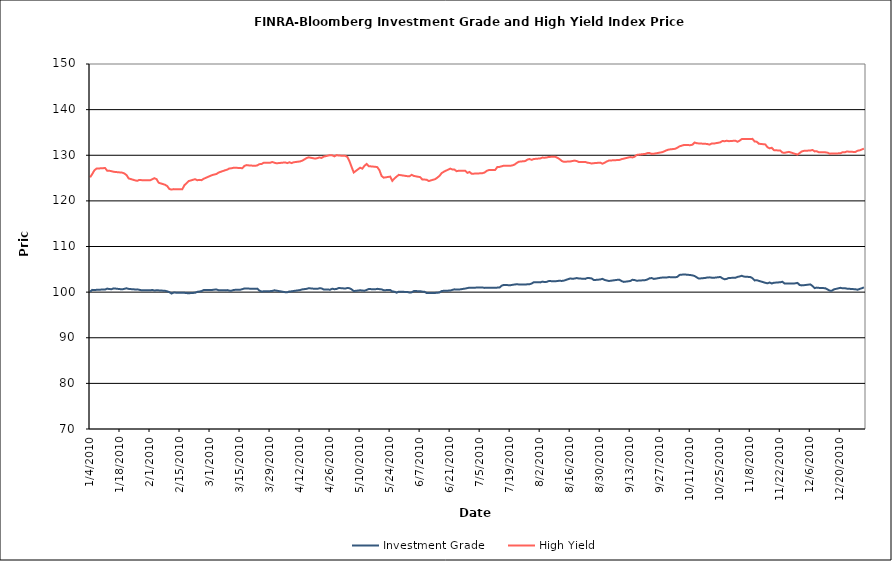
| Category | Investment Grade | High Yield |
|---|---|---|
| 1/4/10 | 100.102 | 125.163 |
| 1/5/10 | 100.49 | 125.873 |
| 1/6/10 | 100.447 | 126.69 |
| 1/7/10 | 100.503 | 127.071 |
| 1/8/10 | 100.542 | 127.104 |
| 1/11/10 | 100.559 | 127.199 |
| 1/12/10 | 100.775 | 126.595 |
| 1/13/10 | 100.668 | 126.609 |
| 1/14/10 | 100.647 | 126.495 |
| 1/15/10 | 100.825 | 126.376 |
| 1/19/10 | 100.604 | 126.186 |
| 1/20/10 | 100.724 | 126.008 |
| 1/21/10 | 100.842 | 125.662 |
| 1/22/10 | 100.705 | 124.921 |
| 1/25/10 | 100.59 | 124.498 |
| 1/26/10 | 100.603 | 124.395 |
| 1/27/10 | 100.508 | 124.599 |
| 1/28/10 | 100.405 | 124.548 |
| 1/29/10 | 100.417 | 124.508 |
| 2/1/10 | 100.394 | 124.505 |
| 2/2/10 | 100.469 | 124.725 |
| 2/3/10 | 100.363 | 124.969 |
| 2/4/10 | 100.396 | 124.762 |
| 2/5/10 | 100.385 | 123.977 |
| 2/8/10 | 100.291 | 123.526 |
| 2/9/10 | 100.167 | 123.238 |
| 2/10/10 | 99.997 | 122.602 |
| 2/11/10 | 99.691 | 122.473 |
| 2/12/10 | 99.896 | 122.576 |
| 2/16/10 | 99.868 | 122.529 |
| 2/17/10 | 99.849 | 123.433 |
| 2/18/10 | 99.79 | 123.864 |
| 2/19/10 | 99.757 | 124.339 |
| 2/22/10 | 99.858 | 124.755 |
| 2/23/10 | 100.056 | 124.527 |
| 2/24/10 | 100.143 | 124.602 |
| 2/25/10 | 100.208 | 124.538 |
| 2/26/10 | 100.466 | 124.842 |
| 3/1/10 | 100.447 | 125.466 |
| 3/2/10 | 100.481 | 125.66 |
| 3/3/10 | 100.547 | 125.78 |
| 3/4/10 | 100.572 | 125.898 |
| 3/5/10 | 100.406 | 126.217 |
| 3/8/10 | 100.383 | 126.711 |
| 3/9/10 | 100.445 | 126.852 |
| 3/10/10 | 100.329 | 127.106 |
| 3/11/10 | 100.316 | 127.14 |
| 3/12/10 | 100.488 | 127.262 |
| 3/15/10 | 100.522 | 127.212 |
| 3/16/10 | 100.654 | 127.15 |
| 3/17/10 | 100.794 | 127.664 |
| 3/18/10 | 100.787 | 127.842 |
| 3/19/10 | 100.77 | 127.776 |
| 3/22/10 | 100.728 | 127.676 |
| 3/23/10 | 100.762 | 127.779 |
| 3/24/10 | 100.328 | 128.048 |
| 3/25/10 | 100.142 | 128.082 |
| 3/26/10 | 100.176 | 128.355 |
| 3/29/10 | 100.218 | 128.357 |
| 3/30/10 | 100.26 | 128.526 |
| 3/31/10 | 100.4 | 128.354 |
| 4/1/10 | 100.318 | 128.234 |
| 4/5/10 | 99.992 | 128.435 |
| 4/6/10 | 99.974 | 128.282 |
| 4/7/10 | 100.148 | 128.468 |
| 4/8/10 | 100.17 | 128.282 |
| 4/9/10 | 100.252 | 128.463 |
| 4/12/10 | 100.46 | 128.647 |
| 4/13/10 | 100.602 | 128.822 |
| 4/14/10 | 100.658 | 129.085 |
| 4/15/10 | 100.72 | 129.378 |
| 4/16/10 | 100.861 | 129.541 |
| 4/19/10 | 100.72 | 129.254 |
| 4/20/10 | 100.713 | 129.364 |
| 4/21/10 | 100.841 | 129.516 |
| 4/22/10 | 100.818 | 129.413 |
| 4/23/10 | 100.588 | 129.707 |
| 4/26/10 | 100.539 | 130.023 |
| 4/27/10 | 100.749 | 129.974 |
| 4/28/10 | 100.637 | 129.76 |
| 4/29/10 | 100.695 | 130.026 |
| 4/30/10 | 100.908 | 129.932 |
| 5/3/10 | 100.788 | 129.878 |
| 5/4/10 | 100.905 | 129.637 |
| 5/5/10 | 100.862 | 128.685 |
| 5/6/10 | 100.609 | 127.446 |
| 5/7/10 | 100.233 | 126.211 |
| 5/10/10 | 100.404 | 127.273 |
| 5/11/10 | 100.358 | 127.056 |
| 5/12/10 | 100.306 | 127.684 |
| 5/13/10 | 100.48 | 128.088 |
| 5/14/10 | 100.68 | 127.605 |
| 5/17/10 | 100.617 | 127.473 |
| 5/18/10 | 100.721 | 127.395 |
| 5/19/10 | 100.652 | 126.706 |
| 5/20/10 | 100.6 | 125.442 |
| 5/21/10 | 100.415 | 125.086 |
| 5/24/10 | 100.481 | 125.319 |
| 5/25/10 | 100.136 | 124.396 |
| 5/26/10 | 100.104 | 124.91 |
| 5/27/10 | 99.874 | 125.323 |
| 5/28/10 | 100.099 | 125.704 |
| 6/1/10 | 100.03 | 125.412 |
| 6/2/10 | 99.906 | 125.392 |
| 6/3/10 | 99.946 | 125.704 |
| 6/4/10 | 100.231 | 125.471 |
| 6/7/10 | 100.206 | 125.2 |
| 6/8/10 | 100.11 | 124.677 |
| 6/9/10 | 100.083 | 124.67 |
| 6/10/10 | 99.801 | 124.634 |
| 6/11/10 | 99.808 | 124.35 |
| 6/14/10 | 99.829 | 124.765 |
| 6/15/10 | 99.86 | 125.1 |
| 6/16/10 | 99.92 | 125.477 |
| 6/17/10 | 100.239 | 126.08 |
| 6/18/10 | 100.29 | 126.379 |
| 6/21/10 | 100.344 | 127.069 |
| 6/22/10 | 100.487 | 126.885 |
| 6/23/10 | 100.61 | 126.856 |
| 6/24/10 | 100.569 | 126.505 |
| 6/25/10 | 100.558 | 126.6 |
| 6/28/10 | 100.784 | 126.599 |
| 6/29/10 | 100.881 | 126.131 |
| 6/30/10 | 100.978 | 126.332 |
| 7/1/10 | 100.965 | 125.953 |
| 7/2/10 | 100.974 | 125.967 |
| 7/6/10 | 101.028 | 126.06 |
| 7/7/10 | 100.928 | 126.207 |
| 7/8/10 | 100.951 | 126.563 |
| 7/9/10 | 100.945 | 126.756 |
| 7/12/10 | 100.939 | 126.793 |
| 7/13/10 | 100.992 | 127.434 |
| 7/14/10 | 100.998 | 127.449 |
| 7/15/10 | 101.414 | 127.578 |
| 7/16/10 | 101.574 | 127.717 |
| 7/19/10 | 101.508 | 127.688 |
| 7/20/10 | 101.593 | 127.776 |
| 7/21/10 | 101.672 | 127.949 |
| 7/22/10 | 101.721 | 128.3 |
| 7/23/10 | 101.691 | 128.582 |
| 7/26/10 | 101.665 | 128.726 |
| 7/27/10 | 101.716 | 129.049 |
| 7/28/10 | 101.723 | 129.168 |
| 7/29/10 | 101.885 | 128.993 |
| 7/30/10 | 102.177 | 129.176 |
| 8/2/10 | 102.135 | 129.303 |
| 8/3/10 | 102.299 | 129.487 |
| 8/4/10 | 102.207 | 129.465 |
| 8/5/10 | 102.25 | 129.5 |
| 8/6/10 | 102.431 | 129.631 |
| 8/9/10 | 102.373 | 129.675 |
| 8/10/10 | 102.438 | 129.445 |
| 8/11/10 | 102.495 | 129.168 |
| 8/12/10 | 102.453 | 128.755 |
| 8/13/10 | 102.521 | 128.568 |
| 8/16/10 | 102.995 | 128.643 |
| 8/17/10 | 102.924 | 128.731 |
| 8/18/10 | 102.975 | 128.831 |
| 8/19/10 | 103.087 | 128.733 |
| 8/20/10 | 102.992 | 128.508 |
| 8/23/10 | 102.902 | 128.534 |
| 8/24/10 | 103.11 | 128.37 |
| 8/25/10 | 103.069 | 128.303 |
| 8/26/10 | 103.004 | 128.195 |
| 8/27/10 | 102.638 | 128.262 |
| 8/30/10 | 102.77 | 128.382 |
| 8/31/10 | 102.91 | 128.147 |
| 9/1/10 | 102.667 | 128.36 |
| 9/2/10 | 102.558 | 128.62 |
| 9/3/10 | 102.437 | 128.836 |
| 9/7/10 | 102.695 | 128.945 |
| 9/8/10 | 102.694 | 128.974 |
| 9/9/10 | 102.414 | 129.155 |
| 9/10/10 | 102.242 | 129.258 |
| 9/13/10 | 102.438 | 129.602 |
| 9/14/10 | 102.704 | 129.521 |
| 9/15/10 | 102.649 | 129.674 |
| 9/16/10 | 102.499 | 130.074 |
| 9/17/10 | 102.528 | 130.135 |
| 9/20/10 | 102.632 | 130.295 |
| 9/21/10 | 102.768 | 130.466 |
| 9/22/10 | 103.038 | 130.485 |
| 9/23/10 | 103.079 | 130.298 |
| 9/24/10 | 102.892 | 130.335 |
| 9/27/10 | 103.136 | 130.598 |
| 9/28/10 | 103.196 | 130.688 |
| 9/29/10 | 103.217 | 130.894 |
| 9/30/10 | 103.213 | 131.102 |
| 10/1/10 | 103.293 | 131.255 |
| 10/4/10 | 103.25 | 131.415 |
| 10/5/10 | 103.36 | 131.667 |
| 10/6/10 | 103.777 | 131.956 |
| 10/7/10 | 103.821 | 132.099 |
| 10/8/10 | 103.882 | 132.244 |
| 10/11/10 | 103.749 | 132.212 |
| 10/12/10 | 103.668 | 132.314 |
| 10/13/10 | 103.535 | 132.793 |
| 10/14/10 | 103.235 | 132.644 |
| 10/15/10 | 102.972 | 132.584 |
| 10/18/10 | 103.11 | 132.508 |
| 10/19/10 | 103.211 | 132.456 |
| 10/20/10 | 103.237 | 132.329 |
| 10/21/10 | 103.168 | 132.579 |
| 10/22/10 | 103.146 | 132.563 |
| 10/25/10 | 103.321 | 132.824 |
| 10/26/10 | 103.025 | 133.129 |
| 10/27/10 | 102.808 | 133.066 |
| 10/28/10 | 102.914 | 133.18 |
| 10/29/10 | 103.11 | 133.087 |
| 11/1/10 | 103.142 | 133.192 |
| 11/2/10 | 103.332 | 132.962 |
| 11/3/10 | 103.438 | 133.19 |
| 11/4/10 | 103.58 | 133.536 |
| 11/5/10 | 103.406 | 133.536 |
| 11/8/10 | 103.31 | 133.557 |
| 11/9/10 | 103.055 | 133.593 |
| 11/10/10 | 102.564 | 133.022 |
| 11/11/10 | 102.616 | 132.97 |
| 11/12/10 | 102.468 | 132.524 |
| 11/15/10 | 102.045 | 132.371 |
| 11/16/10 | 101.932 | 131.763 |
| 11/17/10 | 102.112 | 131.511 |
| 11/18/10 | 101.897 | 131.639 |
| 11/19/10 | 102.054 | 131.122 |
| 11/22/10 | 102.165 | 131.019 |
| 11/23/10 | 102.278 | 130.588 |
| 11/24/10 | 101.864 | 130.542 |
| 11/26/10 | 101.863 | 130.744 |
| 11/29/10 | 101.922 | 130.291 |
| 11/30/10 | 102.022 | 130.145 |
| 12/1/10 | 101.568 | 130.481 |
| 12/2/10 | 101.476 | 130.838 |
| 12/3/10 | 101.519 | 130.961 |
| 12/6/10 | 101.694 | 131.045 |
| 12/7/10 | 101.352 | 131.156 |
| 12/8/10 | 100.876 | 130.842 |
| 12/9/10 | 100.991 | 130.879 |
| 12/10/10 | 100.934 | 130.643 |
| 12/13/10 | 100.857 | 130.642 |
| 12/14/10 | 100.596 | 130.565 |
| 12/15/10 | 100.33 | 130.335 |
| 12/16/10 | 100.307 | 130.398 |
| 12/17/10 | 100.602 | 130.396 |
| 12/20/10 | 100.943 | 130.42 |
| 12/21/10 | 100.841 | 130.656 |
| 12/22/10 | 100.868 | 130.633 |
| 12/23/10 | 100.766 | 130.815 |
| 12/27/10 | 100.627 | 130.708 |
| 12/28/10 | 100.526 | 130.99 |
| 12/29/10 | 100.688 | 131.074 |
| 12/30/10 | 100.846 | 131.261 |
| 12/31/10 | 101.042 | 131.455 |